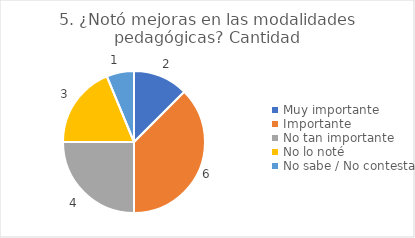
| Category | 5. ¿Notó mejoras en las modalidades pedagógicas? |
|---|---|
| Muy importante  | 0.125 |
| Importante  | 0.375 |
| No tan importante  | 0.25 |
| No lo noté  | 0.188 |
| No sabe / No contesta | 0.062 |